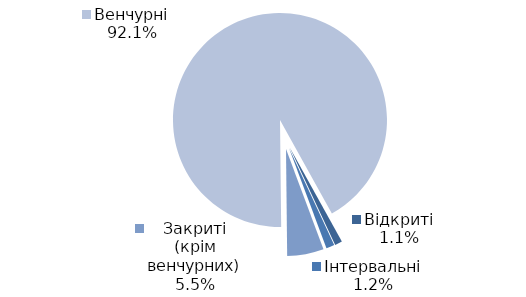
| Category | Series 0 |
|---|---|
| Відкриті | 17 |
| Інтервальні | 19 |
| Закриті (крім венчурних) | 84 |
| Венчурні | 1403 |